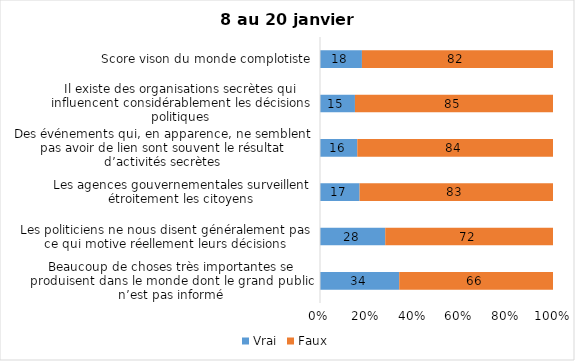
| Category | Vrai | Faux |
|---|---|---|
| Beaucoup de choses très importantes se produisent dans le monde dont le grand public n’est pas informé | 34 | 66 |
| Les politiciens ne nous disent généralement pas ce qui motive réellement leurs décisions | 28 | 72 |
| Les agences gouvernementales surveillent étroitement les citoyens | 17 | 83 |
| Des événements qui, en apparence, ne semblent pas avoir de lien sont souvent le résultat d’activités secrètes | 16 | 84 |
| Il existe des organisations secrètes qui influencent considérablement les décisions politiques | 15 | 85 |
| Score vison du monde complotiste | 18 | 82 |